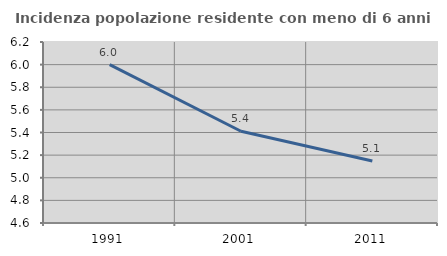
| Category | Incidenza popolazione residente con meno di 6 anni |
|---|---|
| 1991.0 | 6 |
| 2001.0 | 5.411 |
| 2011.0 | 5.149 |